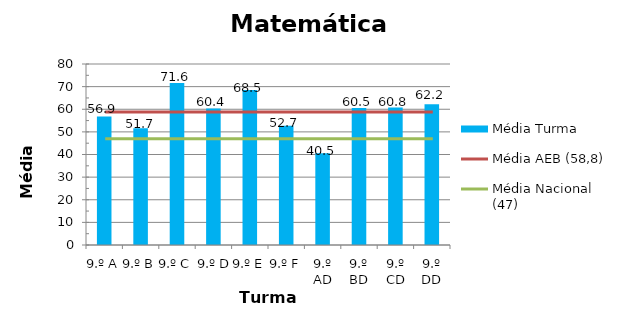
| Category | Média Turma |
|---|---|
| 9.º A | 56.85 |
| 9.º B | 51.65 |
| 9.º C | 71.56 |
| 9.º D | 60.35 |
| 9.º E | 68.5 |
| 9.º F | 52.71 |
| 9.º AD | 40.5 |
| 9.º BD | 60.53 |
| 9.º CD | 60.75 |
| 9.º DD | 62.16 |